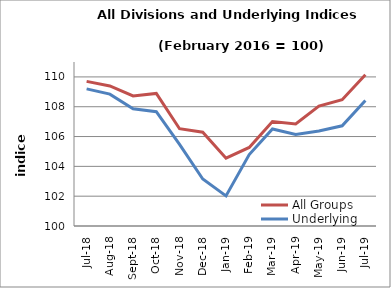
| Category | All Groups | Underlying |
|---|---|---|
| 2018-07-01 | 109.702 | 109.198 |
| 2018-08-01 | 109.392 | 108.845 |
| 2018-09-01 | 108.722 | 107.857 |
| 2018-10-01 | 108.895 | 107.664 |
| 2018-11-01 | 106.524 | 105.471 |
| 2018-12-01 | 106.292 | 103.148 |
| 2019-01-01 | 104.55 | 102.019 |
| 2019-02-01 | 105.272 | 104.794 |
| 2019-03-01 | 107.012 | 106.51 |
| 2019-04-01 | 106.842 | 106.143 |
| 2019-05-01 | 108.044 | 106.37 |
| 2019-06-01 | 108.473 | 106.721 |
| 2019-07-01 | 110.146 | 108.423 |